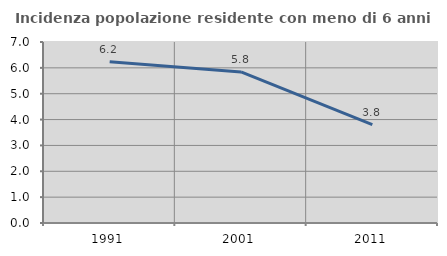
| Category | Incidenza popolazione residente con meno di 6 anni |
|---|---|
| 1991.0 | 6.239 |
| 2001.0 | 5.842 |
| 2011.0 | 3.808 |